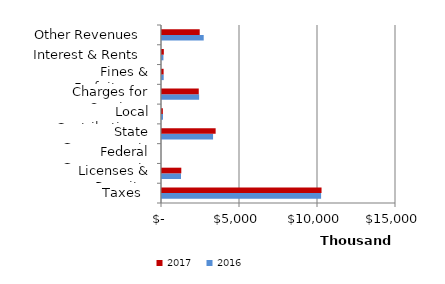
| Category | 2016 | 2017 |
|---|---|---|
| Taxes | 10198174 | 10227120 |
|  Licenses & Permits  | 1219794 | 1237369 |
|  Federal Government  | 0 | 0 |
|  State Government  | 3273975 | 3438616 |
|  Local Contributions  | 63343 | 54565 |
|  Charges for Services  | 2378845 | 2356483 |
|  Fines & Forfeitures  | 109496 | 103692 |
|  Interest & Rents  | 91508 | 117444 |
|  Other Revenues  | 2673922 | 2417076 |